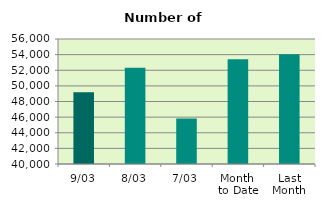
| Category | Series 0 |
|---|---|
| 9/03 | 49180 |
| 8/03 | 52314 |
| 7/03 | 45814 |
| Month 
to Date | 53411.143 |
| Last
Month | 54034.8 |